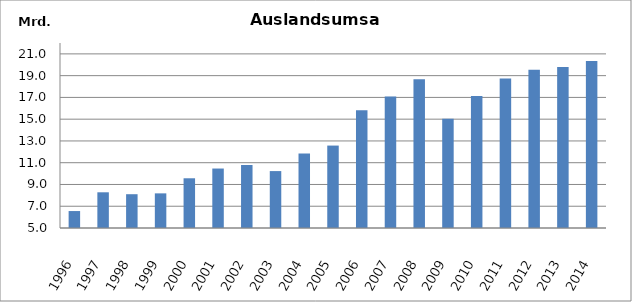
| Category | Series 0 |
|---|---|
| 1996.0 | 6557769 |
| 1997.0 | 8280764 |
| 1998.0 | 8105464 |
| 1999.0 | 8182730 |
| 2000.0 | 9569050 |
| 2001.0 | 10464574 |
| 2002.0 | 10788499 |
| 2003.0 | 10230107 |
| 2004.0 | 11851867 |
| 2005.0 | 12574466 |
| 2006.0 | 15829050 |
| 2007.0 | 17072669 |
| 2008.0 | 18677331 |
| 2009.0 | 15048748 |
| 2010.0 | 17119030.883 |
| 2011.0 | 18748015 |
| 2012.0 | 19537292 |
| 2013.0 | 19797360.276 |
| 2014.0 | 20348090.799 |